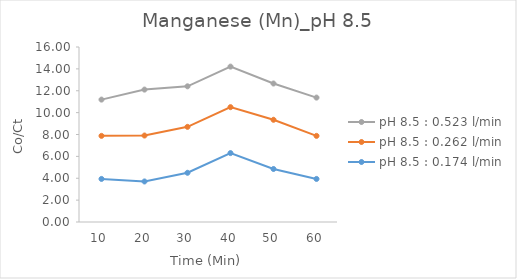
| Category | pH 8.5 : 0.174 l/min | pH 8.5 : 0.262 l/min | pH 8.5 : 0.523 l/min |
|---|---|---|---|
| 10.0 | 3.938 | 3.938 | 3.316 |
| 20.0 | 3.706 | 4.2 | 4.2 |
| 30.0 | 4.5 | 4.2 | 3.706 |
| 40.0 | 6.3 | 4.2 | 3.706 |
| 50.0 | 4.846 | 4.5 | 3.316 |
| 60.0 | 3.938 | 3.938 | 3.5 |